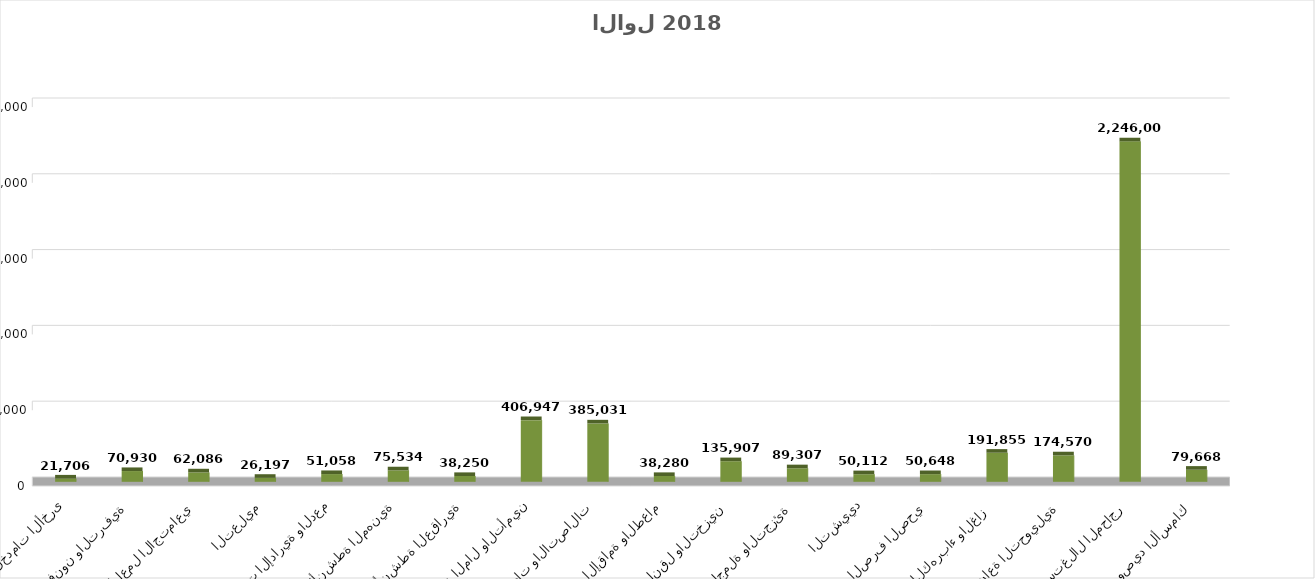
| Category | إنتاجية المشتغل  |
|---|---|
| الزراعة والحراجة وصيد الأسماك | 79668.361 |
| التعدين واستغلال المحاجر | 2246005.339 |
| الصناعة التحويلية | 174569.826 |
| توصيل الكهرباء والغاز  | 191854.564 |
| امدادات الماء والصرف الصحي | 50647.645 |
| التشييد | 50111.553 |
| تجارة الجملة والتجزئة | 89306.934 |
| النقل والتخزين | 135906.99 |
| الإقامة والطعام | 38280.1 |
| المعلومات والاتصالات | 385031.457 |
| أنشطة المال والتأمين | 406946.799 |
| الأنشطة العقارية | 38250.441 |
| الأنشطة المهنية  | 75534.025 |
| الخدمات الإدارية والدعم | 51057.616 |
| التعليم | 26197.219 |
| الصحة والعمل الاجتماعي | 62086.298 |
| الفنون والترفية | 70930.115 |
| الخدمات الأخرى | 21705.802 |